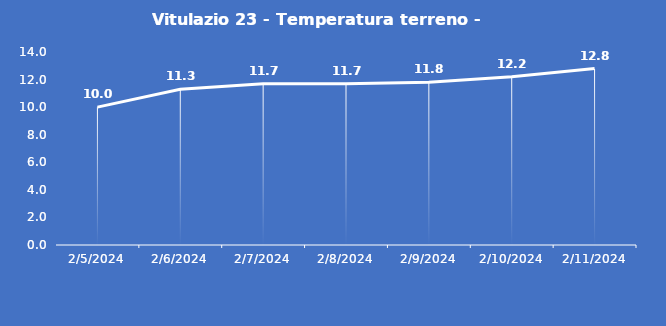
| Category | Vitulazio 23 - Temperatura terreno - Grezzo (°C) |
|---|---|
| 2/5/24 | 10 |
| 2/6/24 | 11.3 |
| 2/7/24 | 11.7 |
| 2/8/24 | 11.7 |
| 2/9/24 | 11.8 |
| 2/10/24 | 12.2 |
| 2/11/24 | 12.8 |